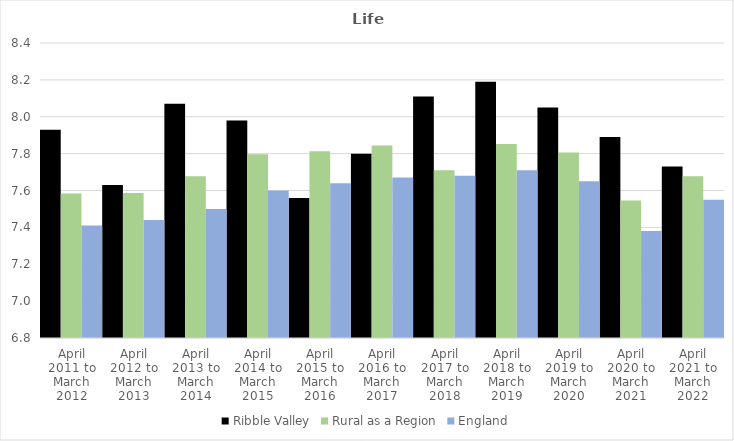
| Category | Ribble Valley | Rural as a Region | England |
|---|---|---|---|
| April 2011 to March 2012 | 7.93 | 7.584 | 7.41 |
| April 2012 to March 2013 | 7.63 | 7.586 | 7.44 |
| April 2013 to March 2014 | 8.07 | 7.677 | 7.5 |
| April 2014 to March 2015 | 7.98 | 7.797 | 7.6 |
| April 2015 to March 2016 | 7.56 | 7.813 | 7.64 |
| April 2016 to March 2017 | 7.8 | 7.845 | 7.67 |
| April 2017 to March 2018 | 8.11 | 7.71 | 7.68 |
| April 2018 to March 2019 | 8.19 | 7.852 | 7.71 |
| April 2019 to March 2020 | 8.05 | 7.806 | 7.65 |
| April 2020 to March 2021 | 7.89 | 7.546 | 7.38 |
| April 2021 to March 2022 | 7.73 | 7.677 | 7.55 |